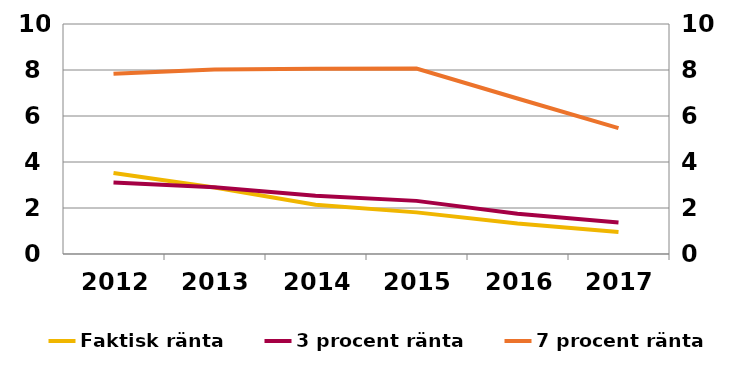
| Category | Faktisk ränta |
|---|---|
| 2012-12-31 | 3.52 |
| 2013-12-31 | 2.89 |
| 2014-12-31 | 2.14 |
| 2015-12-31 | 1.81 |
| 2016-12-31 | 1.33 |
| 2017-12-31 | 0.96 |